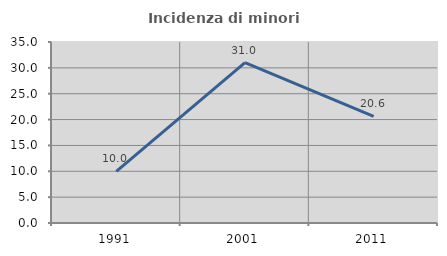
| Category | Incidenza di minori stranieri |
|---|---|
| 1991.0 | 10 |
| 2001.0 | 31 |
| 2011.0 | 20.627 |